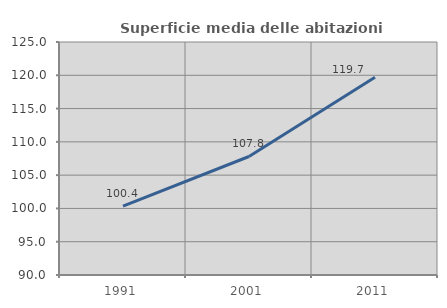
| Category | Superficie media delle abitazioni occupate |
|---|---|
| 1991.0 | 100.356 |
| 2001.0 | 107.802 |
| 2011.0 | 119.714 |